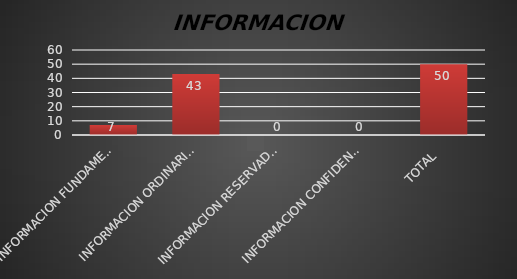
| Category | Series 1 |
|---|---|
| INFORMACION FUNDAMENTAL  | 7 |
| INFORMACION ORDINARIA  | 43 |
| INFORMACION RESERVADA  | 0 |
| INFORMACION CONFIDENCIAL  | 0 |
| TOTAL  | 50 |